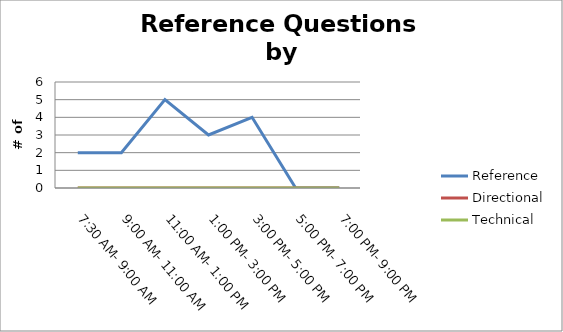
| Category | Reference | Directional | Technical |
|---|---|---|---|
| 7:30 AM- 9:00 AM | 2 | 0 | 0 |
| 9:00 AM- 11:00 AM | 2 | 0 | 0 |
| 11:00 AM- 1:00 PM | 5 | 0 | 0 |
| 1:00 PM- 3:00 PM | 3 | 0 | 0 |
| 3:00 PM- 5:00 PM | 4 | 0 | 0 |
| 5:00 PM- 7:00 PM | 0 | 0 | 0 |
| 7:00 PM- 9:00 PM | 0 | 0 | 0 |